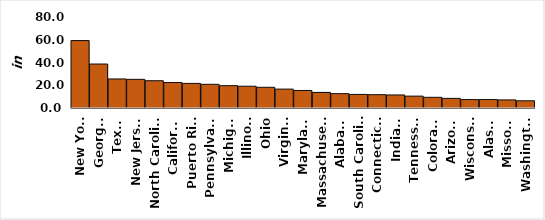
| Category | Series 0 |
|---|---|
| New York | 59288 |
| Georgia | 38658 |
| Texas | 25532 |
| New Jersey | 25206 |
| North Carolina | 23983 |
| California | 22420 |
| Puerto Rico | 21611 |
| Pennsylvania | 20821 |
| Michigan | 19640 |
| Illinois | 19152 |
| Ohio | 18191 |
| Virginia | 16614 |
| Maryland | 15410 |
| Massachusetts | 13701 |
| Alabama | 12635 |
| South Carolina | 11953 |
| Connecticut | 11704 |
| Indiana | 11472 |
| Tennessee | 10451 |
| Colorado | 9383 |
| Arizona | 8451 |
| Wisconsin | 7412 |
| Alaska | 7405 |
| Missouri | 7114 |
| Washington | 6339 |